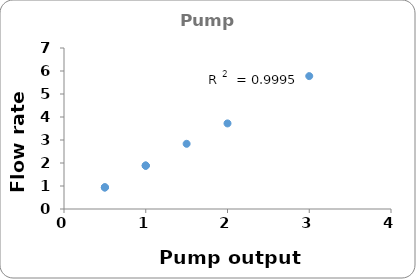
| Category | Series 0 |
|---|---|
| 3.0 | 5.778 |
| 2.0 | 3.721 |
| 1.5 | 2.834 |
| 1.0 | 1.89 |
| 1.0 | 1.882 |
| 1.0 | 1.887 |
| 0.5 | 0.939 |
| 0.5 | 0.943 |
| 0.5 | 0.935 |